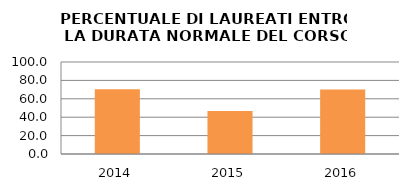
| Category | 2014 2015 2016 |
|---|---|
| 2014.0 | 70.455 |
| 2015.0 | 46.667 |
| 2016.0 | 70 |